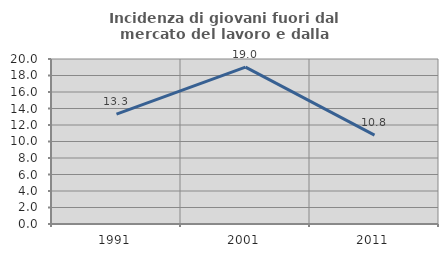
| Category | Incidenza di giovani fuori dal mercato del lavoro e dalla formazione  |
|---|---|
| 1991.0 | 13.314 |
| 2001.0 | 19.011 |
| 2011.0 | 10.769 |